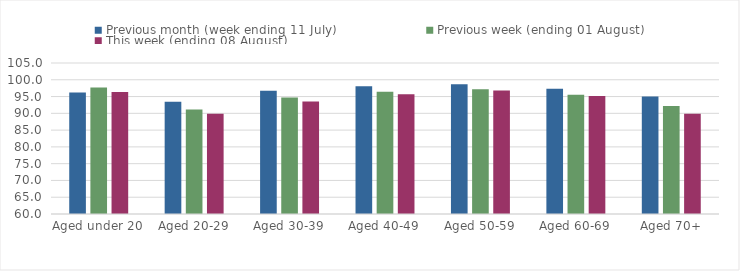
| Category | Previous month (week ending 11 July) | Previous week (ending 01 August) | This week (ending 08 August) |
|---|---|---|---|
| Aged under 20 | 96.185 | 97.67 | 96.342 |
| Aged 20-29 | 93.439 | 91.16 | 89.911 |
| Aged 30-39 | 96.738 | 94.725 | 93.503 |
| Aged 40-49 | 98.06 | 96.459 | 95.704 |
| Aged 50-59 | 98.643 | 97.14 | 96.774 |
| Aged 60-69 | 97.361 | 95.523 | 95.175 |
| Aged 70+ | 95.026 | 92.214 | 89.901 |